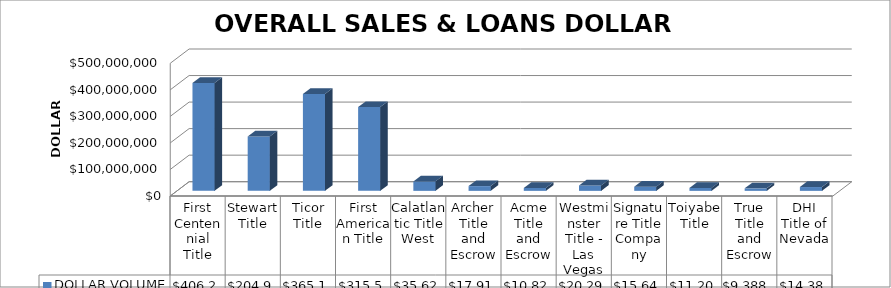
| Category | DOLLAR VOLUME |
|---|---|
| First Centennial Title | 406271037.5 |
| Stewart Title | 204938204.32 |
| Ticor Title | 365152381.78 |
| First American Title | 315554882.61 |
| Calatlantic Title West | 35626284 |
| Archer Title and Escrow | 17913076.5 |
| Acme Title and Escrow | 10828595 |
| Westminster Title - Las Vegas | 20290403 |
| Signature Title Company | 15646900 |
| Toiyabe Title | 11201437 |
| True Title and Escrow | 9388035 |
| DHI Title of Nevada | 14381350 |